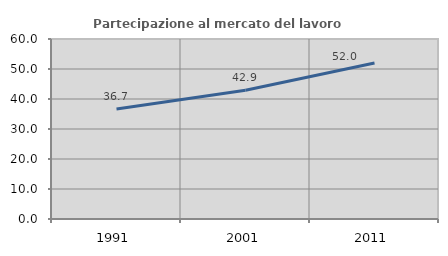
| Category | Partecipazione al mercato del lavoro  femminile |
|---|---|
| 1991.0 | 36.698 |
| 2001.0 | 42.931 |
| 2011.0 | 51.977 |